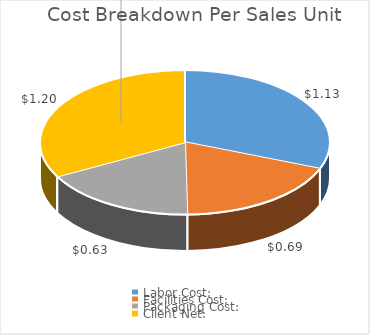
| Category | Client Cost:  |
|---|---|
| Labor Cost:  | 1.132 |
| Facilities Cost:  | 0.686 |
| Packaging Cost:  | 0.635 |
| Client Net:  | 1.2 |